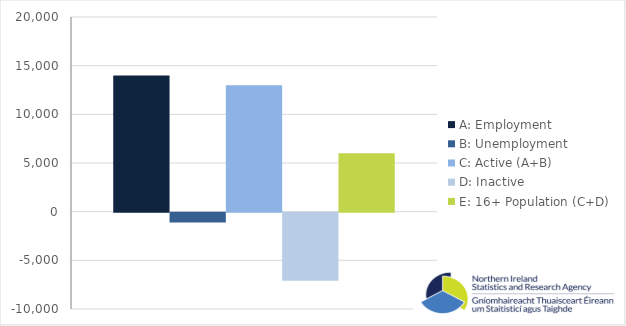
| Category | A: Employment | B: Unemployment | C: Active (A+B) | D: Inactive | E: 16+ Population (C+D) |
|---|---|---|---|---|---|
| 0 | 14000 | -1000 | 13000 | -7000 | 6000 |